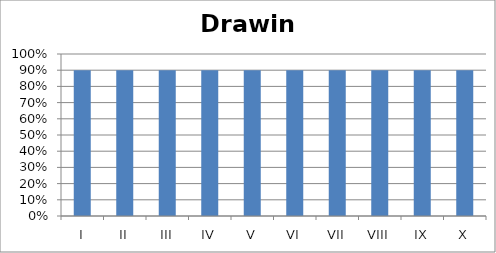
| Category | Drawing |
|---|---|
| I | 0.9 |
| II | 0.9 |
| III | 0.9 |
| IV | 0.9 |
| V | 0.9 |
| VI | 0.9 |
| VII | 0.9 |
| VIII | 0.9 |
| IX | 0.9 |
| X | 0.9 |